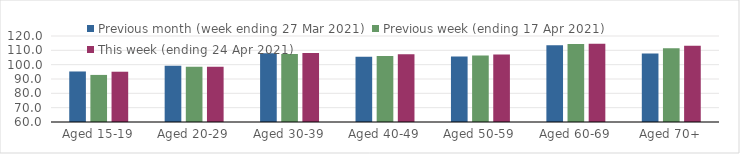
| Category | Previous month (week ending 27 Mar 2021) | Previous week (ending 17 Apr 2021) | This week (ending 24 Apr 2021) |
|---|---|---|---|
| Aged 15-19 | 95.25 | 92.85 | 95.08 |
| Aged 20-29 | 99.16 | 98.61 | 98.61 |
| Aged 30-39 | 108.03 | 107.46 | 108.12 |
| Aged 40-49 | 105.58 | 106.01 | 107.27 |
| Aged 50-59 | 105.77 | 106.48 | 107.05 |
| Aged 60-69 | 113.6 | 114.46 | 114.54 |
| Aged 70+ | 107.78 | 111.39 | 113.21 |